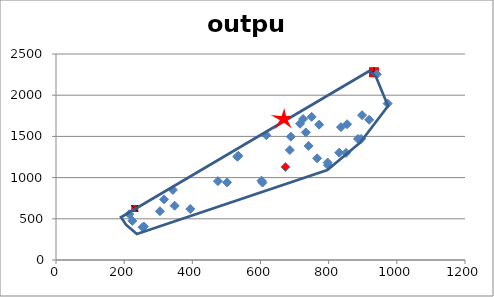
| Category | output |
|---|---|
| 617.0 | 1514.147 |
| 933.0 | 2279.163 |
| 686.0 | 1334.711 |
| 798.0 | 1150.989 |
| 772.0 | 1642.587 |
| 898.0 | 1757.538 |
| 689.0 | 1496.801 |
| 475.0 | 956.945 |
| 231.0 | 625.291 |
| 224.0 | 475.19 |
| 603.0 | 962.697 |
| 733.0 | 1548.566 |
| 716.0 | 1653.821 |
| 343.0 | 850.223 |
| 254.0 | 397.7 |
| 973.0 | 1898.314 |
| 741.0 | 1384.62 |
| 831.0 | 1302.686 |
| 941.0 | 2253.854 |
| 215.0 | 555.154 |
| 886.0 | 1469.224 |
| 750.0 | 1737.354 |
| 348.0 | 658.775 |
| 535.0 | 1264.963 |
| 394.0 | 618.638 |
| 797.0 | 1182.389 |
| 305.0 | 591.479 |
| 258.0 | 405.288 |
| 532.0 | 1253.423 |
| 895.0 | 1468.858 |
| 851.0 | 1299.921 |
| 725.0 | 1711.766 |
| 919.0 | 1702.145 |
| 317.0 | 735.977 |
| 836.0 | 1612.591 |
| 606.0 | 939.599 |
| 673.0 | 1128.763 |
| 766.0 | 1234.602 |
| 854.0 | 1648.183 |
| 502.0 | 941.723 |